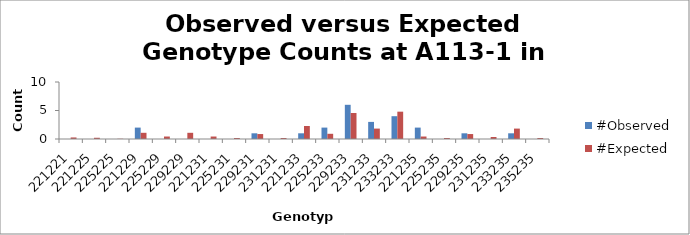
| Category | #Observed | #Expected |
|---|---|---|
| 221221.0 | 0 | 0.272 |
| 221225.0 | 0 | 0.217 |
| 225225.0 | 0 | 0.043 |
| 221229.0 | 2 | 1.087 |
| 225229.0 | 0 | 0.435 |
| 229229.0 | 0 | 1.087 |
| 221231.0 | 0 | 0.435 |
| 225231.0 | 0 | 0.174 |
| 229231.0 | 1 | 0.87 |
| 231231.0 | 0 | 0.174 |
| 221233.0 | 1 | 2.283 |
| 225233.0 | 2 | 0.913 |
| 229233.0 | 6 | 4.565 |
| 231233.0 | 3 | 1.826 |
| 233233.0 | 4 | 4.793 |
| 221235.0 | 2 | 0.435 |
| 225235.0 | 0 | 0.174 |
| 229235.0 | 1 | 0.87 |
| 231235.0 | 0 | 0.348 |
| 233235.0 | 1 | 1.826 |
| 235235.0 | 0 | 0.174 |